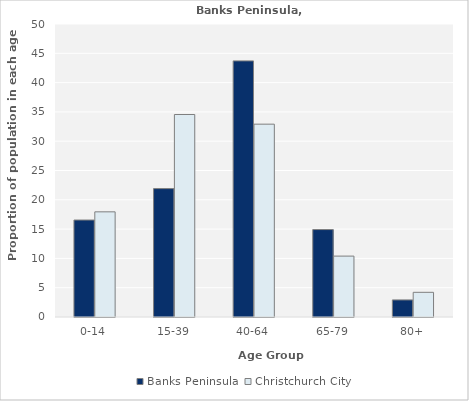
| Category | Banks Peninsula | Christchurch City |
|---|---|---|
| 0-14 | 16.55 | 17.945 |
| 15-39 | 21.911 | 34.556 |
| 40-64 | 43.706 | 32.907 |
| 65-79 | 14.918 | 10.392 |
| 80+ | 2.914 | 4.211 |